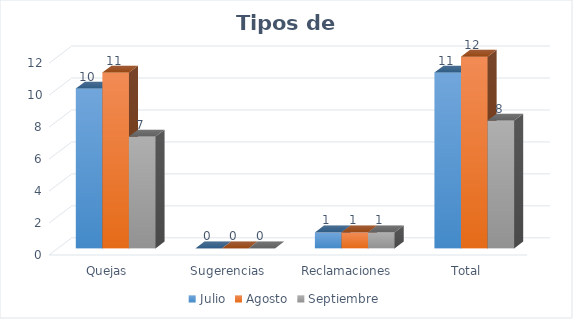
| Category | Julio | Agosto | Septiembre |
|---|---|---|---|
| Quejas | 10 | 11 | 7 |
| Sugerencias | 0 | 0 | 0 |
| Reclamaciones | 1 | 1 | 1 |
| Total | 11 | 12 | 8 |